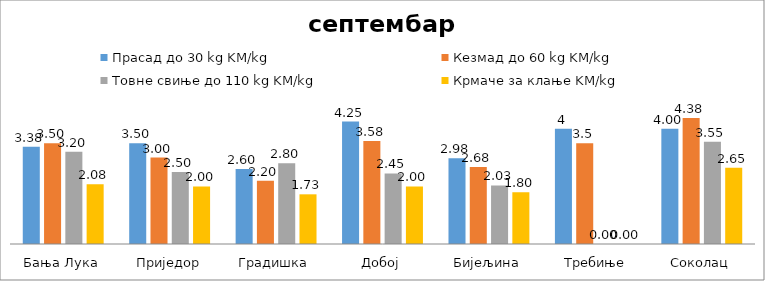
| Category | Прасад до 30 kg KM/kg | Кезмад до 60 kg KM/kg | Товне свиње до 110 kg KM/kg | Крмаче за клање KM/kg |
|---|---|---|---|---|
| Бања Лука | 3.375 | 3.5 | 3.2 | 2.075 |
| Приједор | 3.5 | 3 | 2.5 | 2 |
| Градишка | 2.6 | 2.2 | 2.8 | 1.725 |
| Добој | 4.25 | 3.575 | 2.45 | 2 |
| Бијељина | 2.975 | 2.675 | 2.033 | 1.8 |
|  Требиње | 4 | 3.5 | 0 | 0 |
| Соколац | 4 | 4.375 | 3.55 | 2.65 |